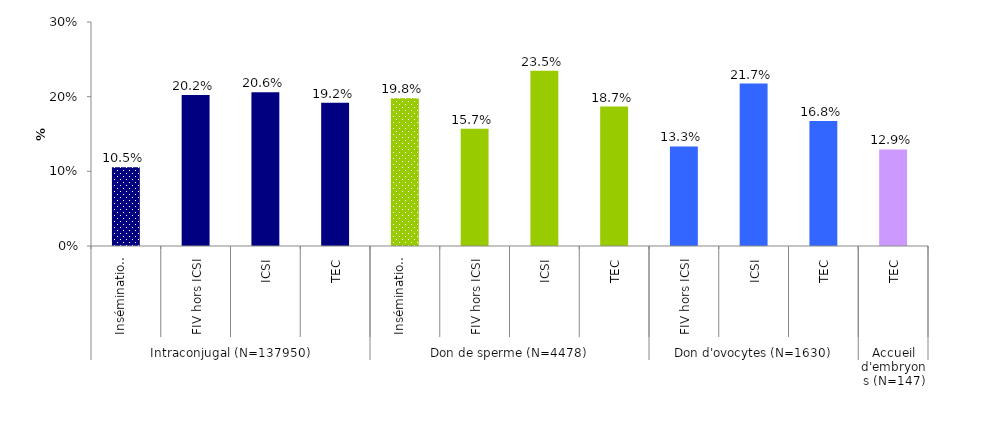
| Category | Series 0 |
|---|---|
| 0 | 0.105 |
| 1 | 0.202 |
| 2 | 0.206 |
| 3 | 0.192 |
| 4 | 0.198 |
| 5 | 0.157 |
| 6 | 0.235 |
| 7 | 0.187 |
| 8 | 0.133 |
| 9 | 0.217 |
| 10 | 0.168 |
| 11 | 0.129 |